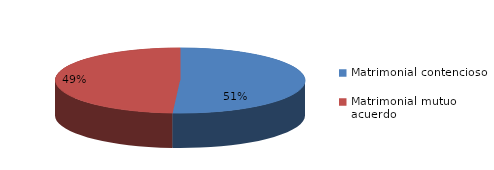
| Category | Series 0 |
|---|---|
| 0 | 6047 |
| 1 | 5824 |